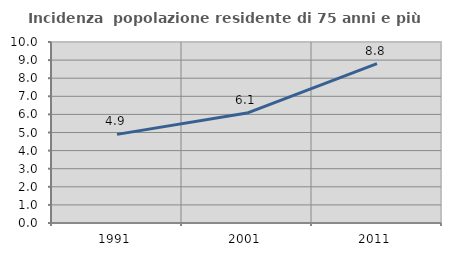
| Category | Incidenza  popolazione residente di 75 anni e più |
|---|---|
| 1991.0 | 4.897 |
| 2001.0 | 6.072 |
| 2011.0 | 8.803 |